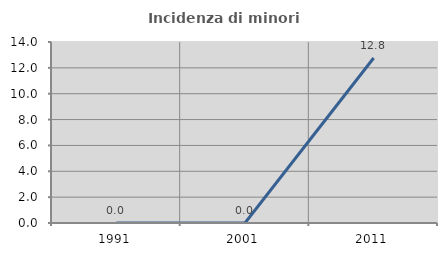
| Category | Incidenza di minori stranieri |
|---|---|
| 1991.0 | 0 |
| 2001.0 | 0 |
| 2011.0 | 12.766 |